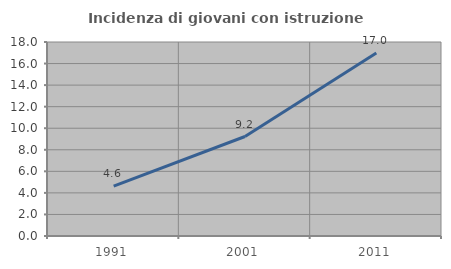
| Category | Incidenza di giovani con istruzione universitaria |
|---|---|
| 1991.0 | 4.63 |
| 2001.0 | 9.231 |
| 2011.0 | 16.981 |